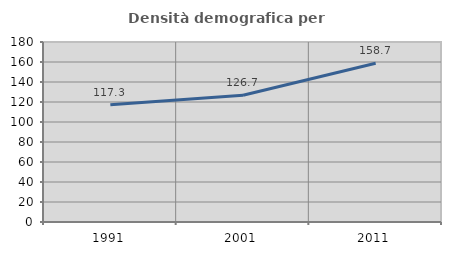
| Category | Densità demografica |
|---|---|
| 1991.0 | 117.315 |
| 2001.0 | 126.684 |
| 2011.0 | 158.728 |